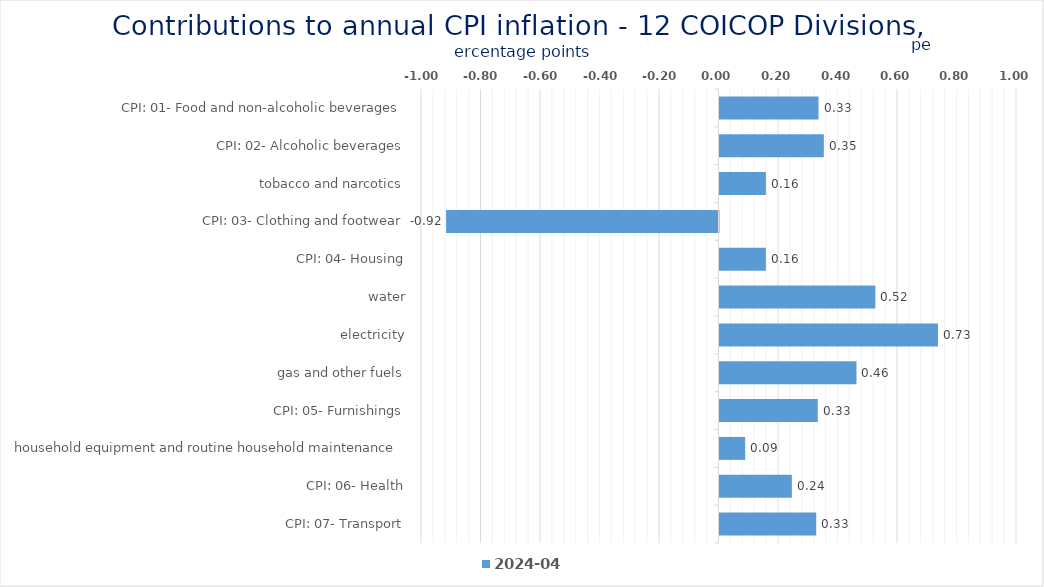
| Category | 2024-04 |
|---|---|
| CPI: 01- Food and non-alcoholic beverages | 0.333 |
| CPI: 02- Alcoholic beverages, tobacco and narcotics | 0.351 |
| CPI: 03- Clothing and footwear | 0.156 |
| CPI: 04- Housing, water, electricity, gas and other fuels | -0.916 |
| CPI: 05- Furnishings, household equipment and routine household maintenance | 0.156 |
| CPI: 06- Health | 0.524 |
| CPI: 07- Transport | 0.734 |
| CPI: 08- Communication | 0.46 |
| CPI: 09- Recreation and culture | 0.33 |
| CPI: 10- Education | 0.086 |
| CPI: 11- Restaurants and hotels | 0.243 |
| CPI: 12- Miscellaneous goods and services | 0.325 |